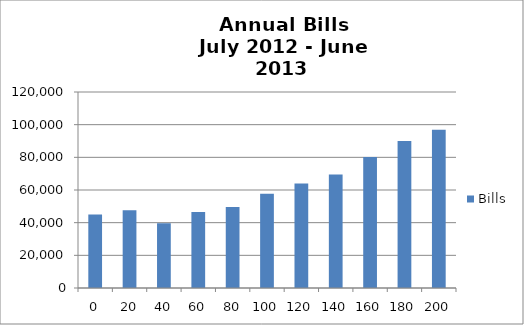
| Category | Bills |
|---|---|
| 0.0 | 44968.478 |
| 20.0 | 47668.77 |
| 40.0 | 39649.939 |
| 60.0 | 46489.332 |
| 80.0 | 49517.582 |
| 100.0 | 57656.993 |
| 120.0 | 63908.607 |
| 140.0 | 69434.001 |
| 160.0 | 80186.75 |
| 180.0 | 90042.073 |
| 200.0 | 96942.154 |